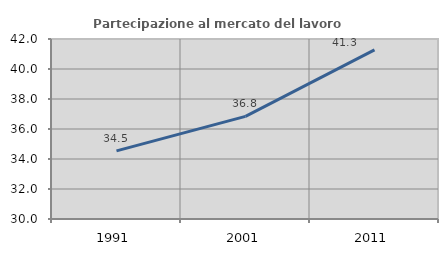
| Category | Partecipazione al mercato del lavoro  femminile |
|---|---|
| 1991.0 | 34.539 |
| 2001.0 | 36.842 |
| 2011.0 | 41.276 |